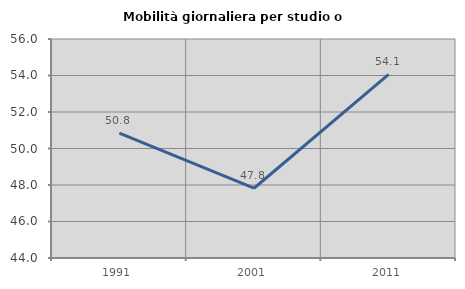
| Category | Mobilità giornaliera per studio o lavoro |
|---|---|
| 1991.0 | 50.84 |
| 2001.0 | 47.823 |
| 2011.0 | 54.059 |